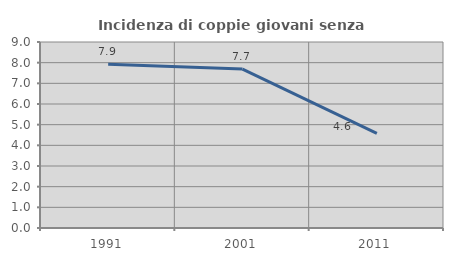
| Category | Incidenza di coppie giovani senza figli |
|---|---|
| 1991.0 | 7.928 |
| 2001.0 | 7.692 |
| 2011.0 | 4.583 |